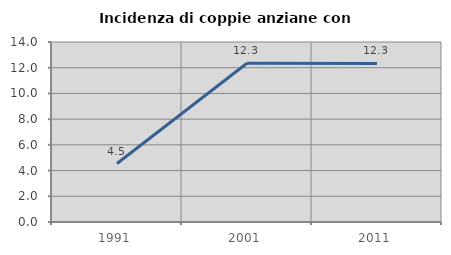
| Category | Incidenza di coppie anziane con figli |
|---|---|
| 1991.0 | 4.545 |
| 2001.0 | 12.346 |
| 2011.0 | 12.329 |